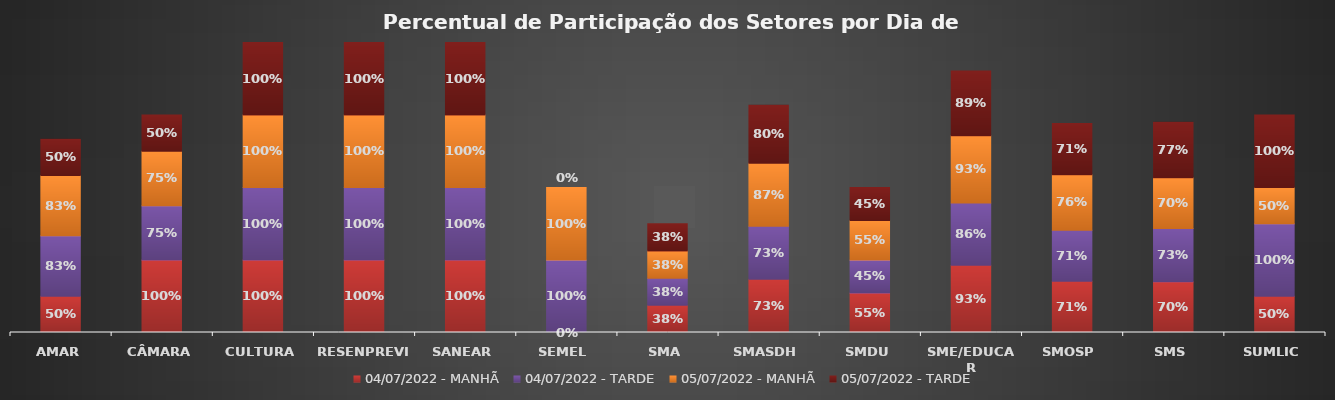
| Category | 04/07/2022 - MANHÃ | 04/07/2022 - TARDE | 05/07/2022 - MANHÃ | 05/07/2022 - TARDE |
|---|---|---|---|---|
| AMAR | 0.5 | 0.833 | 0.833 | 0.5 |
| CÂMARA | 1 | 0.75 | 0.75 | 0.5 |
| CULTURA | 1 | 1 | 1 | 1 |
| RESENPREVI | 1 | 1 | 1 | 1 |
| SANEAR | 1 | 1 | 1 | 1 |
| SEMEL | 0 | 1 | 1 | 0 |
| SMA | 0.375 | 0.375 | 0.375 | 0.375 |
| SMASDH | 0.733 | 0.733 | 0.867 | 0.8 |
| SMDU | 0.545 | 0.455 | 0.545 | 0.455 |
| SME/EDUCAR | 0.929 | 0.857 | 0.929 | 0.893 |
| SMOSP | 0.706 | 0.706 | 0.765 | 0.706 |
| SMS | 0.7 | 0.733 | 0.7 | 0.767 |
| SUMLIC | 0.5 | 1 | 0.5 | 1 |